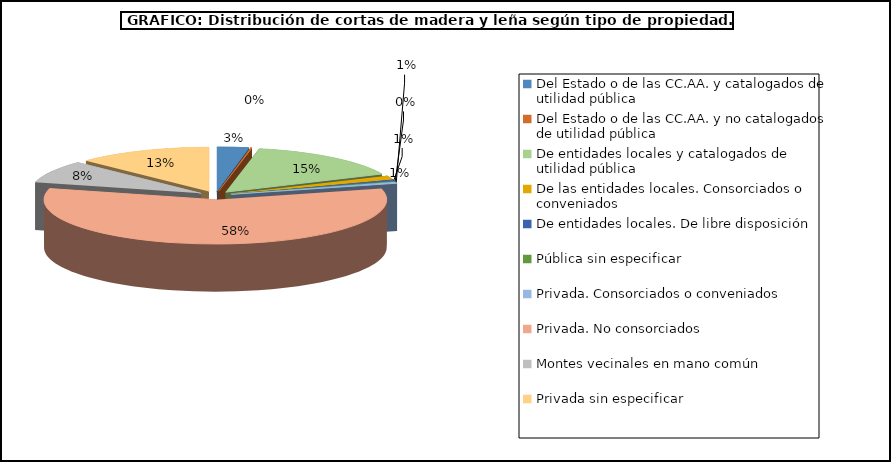
| Category | Series 0 |
|---|---|
| Del Estado o de las CC.AA. y catalogados de utilidad pública | 496857.52 |
| Del Estado o de las CC.AA. y no catalogados de utilidad pública | 23407 |
| De entidades locales y catalogados de utilidad pública | 2517716.08 |
| De las entidades locales. Consorciados o conveniados | 220402.89 |
| De entidades locales. De libre disposición | 119942.95 |
| Pública sin especificar | 8940.12 |
| Privada. Consorciados o conveniados | 96027.5 |
| Privada. No consorciados | 9663271.55 |
| Montes vecinales en mano común | 1363810 |
| Privada sin especificar | 2119436.52 |